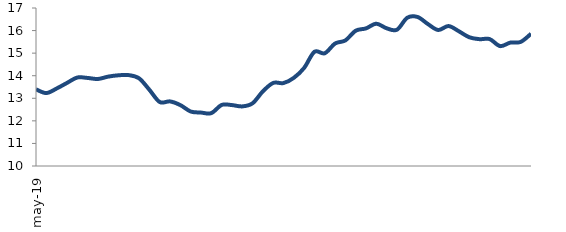
| Category | Series 0 |
|---|---|
| 2019-05-01 | 13.397 |
| 2019-06-01 | 13.231 |
| 2019-07-01 | 13.433 |
| 2019-08-01 | 13.679 |
| 2019-09-01 | 13.92 |
| 2019-10-01 | 13.901 |
| 2019-11-01 | 13.855 |
| 2019-12-01 | 13.96 |
| 2020-01-01 | 14.019 |
| 2020-02-01 | 14.026 |
| 2020-03-01 | 13.882 |
| 2020-04-01 | 13.374 |
| 2020-05-01 | 12.833 |
| 2020-06-01 | 12.862 |
| 2020-07-01 | 12.698 |
| 2020-08-01 | 12.414 |
| 2020-09-01 | 12.367 |
| 2020-10-01 | 12.342 |
| 2020-11-01 | 12.705 |
| 2020-12-01 | 12.699 |
| 2021-01-01 | 12.641 |
| 2021-02-01 | 12.779 |
| 2021-03-01 | 13.308 |
| 2021-04-01 | 13.679 |
| 2021-05-01 | 13.675 |
| 2021-06-01 | 13.905 |
| 2021-07-01 | 14.345 |
| 2021-08-01 | 15.059 |
| 2021-09-01 | 14.995 |
| 2021-10-01 | 15.427 |
| 2021-11-01 | 15.564 |
| 2021-12-01 | 15.993 |
| 2022-01-01 | 16.097 |
| 2022-02-01 | 16.304 |
| 2022-03-01 | 16.101 |
| 2022-04-01 | 16.037 |
| 2022-05-01 | 16.568 |
| 2022-06-01 | 16.602 |
| 2022-07-01 | 16.29 |
| 2022-08-01 | 16.026 |
| 2022-09-01 | 16.201 |
| 2022-10-01 | 15.97 |
| 2022-11-01 | 15.706 |
| 2022-12-01 | 15.62 |
| 2023-01-01 | 15.621 |
| 2023-02-01 | 15.312 |
| 2023-03-01 | 15.467 |
| 2023-04-01 | 15.498 |
| 2023-05-01 | 15.858 |